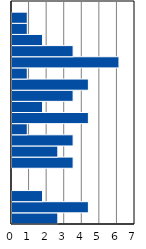
| Category | Series 0 |
|---|---|
| 0-4 | 2.609 |
| 5-9 | 4.348 |
| 10-14 | 1.739 |
| 15-19 | 0 |
| 20-24 | 0 |
| 25-29 | 3.478 |
| 30-34 | 2.609 |
| 35-39 | 3.478 |
| 40-44 | 0.87 |
| 45-49 | 4.348 |
| 50-54 | 1.739 |
| 55-59 | 3.478 |
| 60-64 | 4.348 |
| 65-69 | 0.87 |
| 70-74 | 6.087 |
| 75-79 | 3.478 |
| 80-84 | 1.739 |
| 85-89 | 0.87 |
| 90-94 | 0.87 |
| 95+ | 0 |